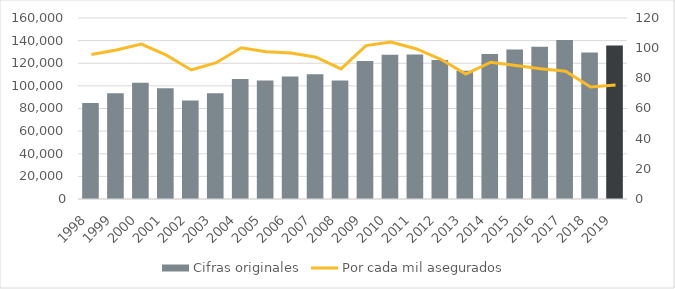
| Category | Cifras originales |
|---|---|
| 1998.0 | 84936 |
| 1999.0 | 93564 |
| 2000.0 | 102790 |
| 2001.0 | 97844 |
| 2002.0 | 87059 |
| 2003.0 | 93452 |
| 2004.0 | 105971 |
| 2005.0 | 104794 |
| 2006.0 | 108363 |
| 2007.0 | 110264 |
| 2008.0 | 104686 |
| 2009.0 | 121915 |
| 2010.0 | 127591 |
| 2011.0 | 127775 |
| 2012.0 | 122954 |
| 2013.0 | 113283 |
| 2014.0 | 128145 |
| 2015.0 | 132145 |
| 2016.0 | 134578 |
| 2017.0 | 140653 |
| 2018.0 | 129446 |
| 2019.0 | 135675 |